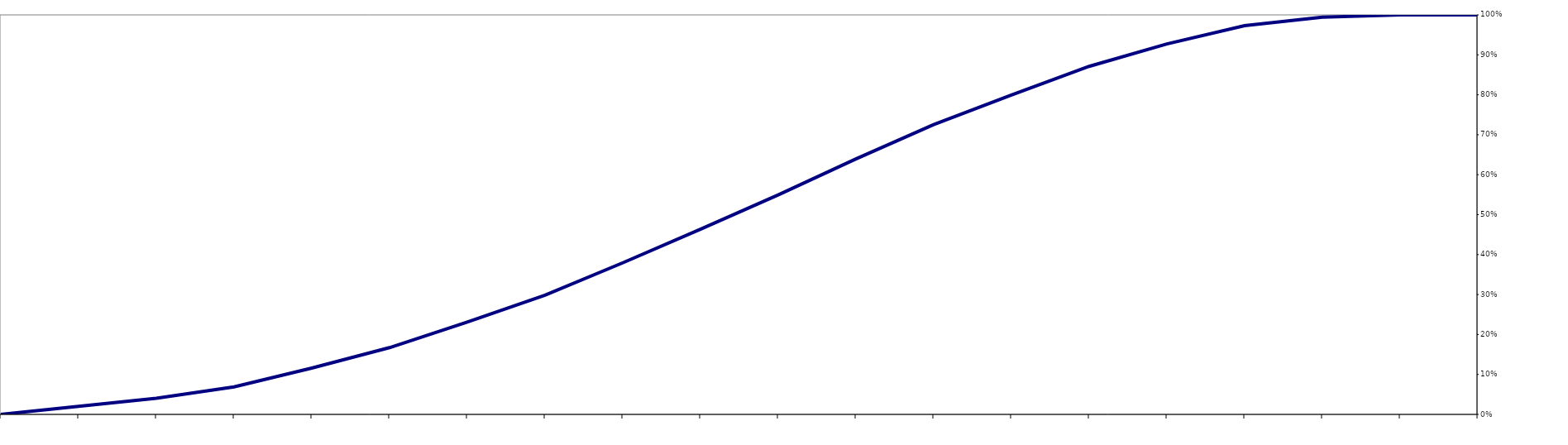
| Category | Series 0 |
|---|---|
| 0 | 0 |
| 1 | 0.02 |
| 2 | 0.04 |
| 3 | 0.069 |
| 4 | 0.116 |
| 5 | 0.167 |
| 6 | 0.231 |
| 7 | 0.298 |
| 8 | 0.379 |
| 9 | 0.463 |
| 10 | 0.55 |
| 11 | 0.64 |
| 12 | 0.725 |
| 13 | 0.799 |
| 14 | 0.871 |
| 15 | 0.927 |
| 16 | 0.973 |
| 17 | 0.994 |
| 18 | 1 |
| 19 | 1 |